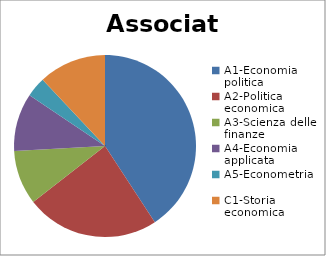
| Category | Associati | Series 1 |
|---|---|---|
| A1-Economia politica | 241 |  |
| A2-Politica economica | 140 |  |
| A3-Scienza delle finanze | 57 |  |
| A4-Economia applicata | 61 |  |
| A5-Econometria | 21 |  |
| C1-Storia economica | 71 |  |